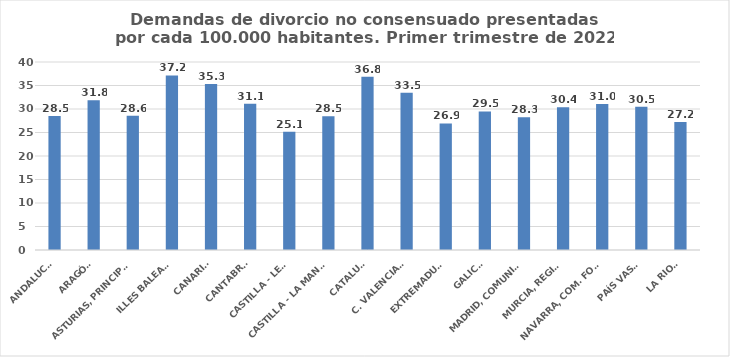
| Category | Series 0 |
|---|---|
| ANDALUCÍA | 28.493 |
| ARAGÓN | 31.841 |
| ASTURIAS, PRINCIPADO | 28.571 |
| ILLES BALEARS | 37.152 |
| CANARIAS | 35.333 |
| CANTABRIA | 31.099 |
| CASTILLA - LEÓN | 25.147 |
| CASTILLA - LA MANCHA | 28.457 |
| CATALUÑA | 36.848 |
| C. VALENCIANA | 33.452 |
| EXTREMADURA | 26.939 |
| GALICIA | 29.489 |
| MADRID, COMUNIDAD | 28.26 |
| MURCIA, REGIÓN | 30.364 |
| NAVARRA, COM. FORAL | 31.042 |
| PAÍS VASCO | 30.491 |
| LA RIOJA | 27.231 |